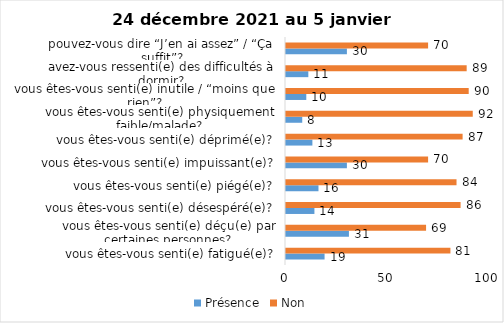
| Category | Présence | Non |
|---|---|---|
| vous êtes-vous senti(e) fatigué(e)? | 19 | 81 |
| vous êtes-vous senti(e) déçu(e) par certaines personnes? | 31 | 69 |
| vous êtes-vous senti(e) désespéré(e)? | 14 | 86 |
| vous êtes-vous senti(e) piégé(e)? | 16 | 84 |
| vous êtes-vous senti(e) impuissant(e)? | 30 | 70 |
| vous êtes-vous senti(e) déprimé(e)? | 13 | 87 |
| vous êtes-vous senti(e) physiquement faible/malade? | 8 | 92 |
| vous êtes-vous senti(e) inutile / “moins que rien”? | 10 | 90 |
| avez-vous ressenti(e) des difficultés à dormir? | 11 | 89 |
| pouvez-vous dire “J’en ai assez” / “Ça suffit”? | 30 | 70 |